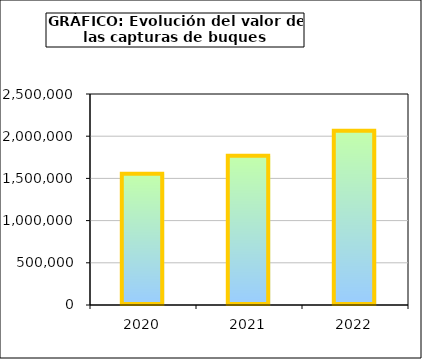
| Category | Series1 |
|---|---|
| 2020.0 | 1554414.547 |
| 2021.0 | 1767191.289 |
| 2022.0 | 2065745.569 |